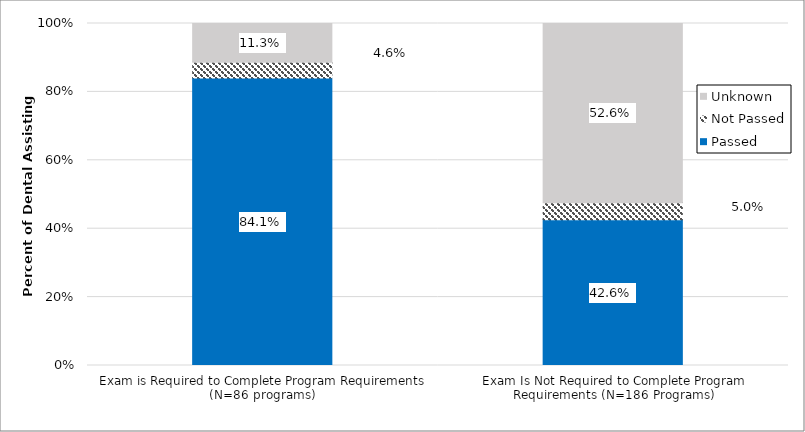
| Category | Passed | Not Passed | Unknown |
|---|---|---|---|
| Exam is Required to Complete Program Requirements (N=86 programs) | 0.841 | 0.046 | 0.113 |
| Exam Is Not Required to Complete Program Requirements (N=186 Programs) | 0.426 | 0.05 | 0.526 |